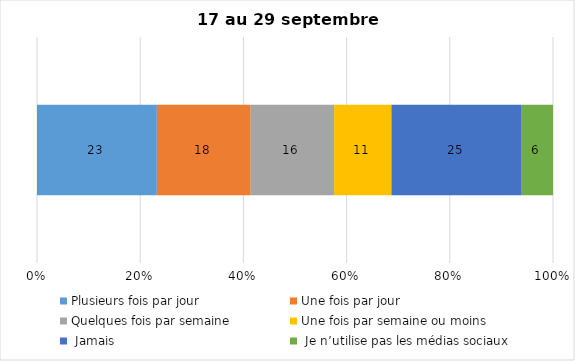
| Category | Plusieurs fois par jour | Une fois par jour | Quelques fois par semaine   | Une fois par semaine ou moins   |  Jamais   |  Je n’utilise pas les médias sociaux |
|---|---|---|---|---|---|---|
| 0 | 23 | 18 | 16 | 11 | 25 | 6 |